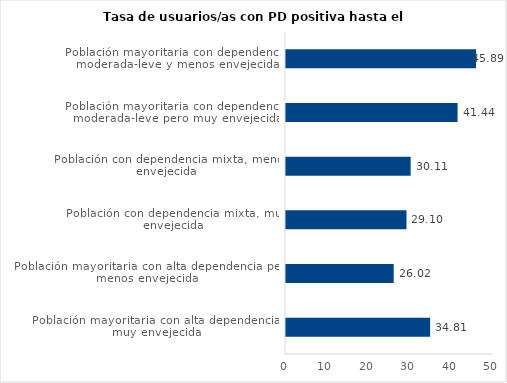
| Category | Series 0 |
|---|---|
| Población mayoritaria con alta dependencia y muy envejecida | 34.814 |
| Población mayoritaria con alta dependencia pero menos envejecida | 26.018 |
| Población con dependencia mixta, muy envejecida | 29.102 |
| Población con dependencia mixta, menos envejecida | 30.109 |
| Población mayoritaria con dependencia moderada-leve pero muy envejecida | 41.44 |
| Población mayoritaria con dependencia moderada-leve y menos envejecida | 45.895 |